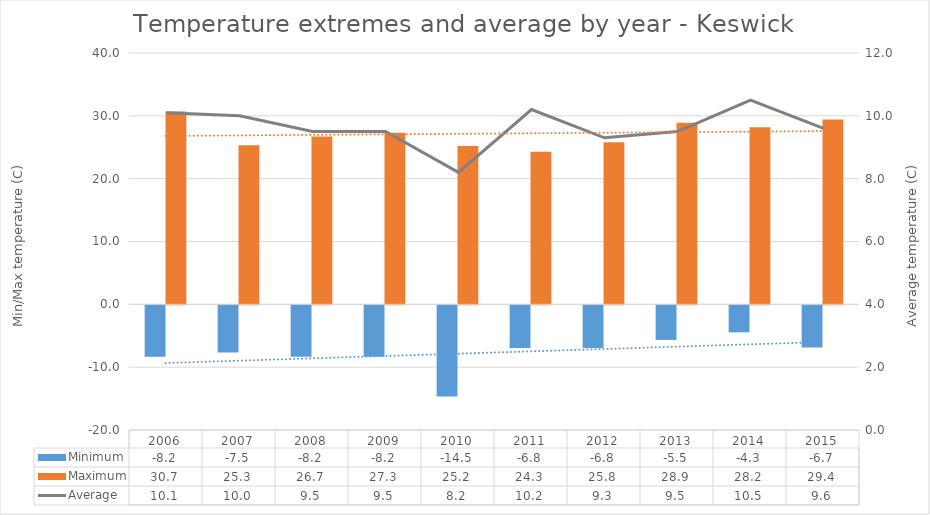
| Category | Minimum | Maximum |
|---|---|---|
| 2006 | -8.2 | 30.7 |
| 2007 | -7.5 | 25.3 |
| 2008 | -8.2 | 26.7 |
| 2009 | -8.2 | 27.3 |
| 2010 | -14.5 | 25.2 |
| 2011 | -6.8 | 24.3 |
| 2012 | -6.8 | 25.8 |
| 2013 | -5.5 | 28.9 |
| 2014 | -4.3 | 28.2 |
| 2015 | -6.7 | 29.4 |